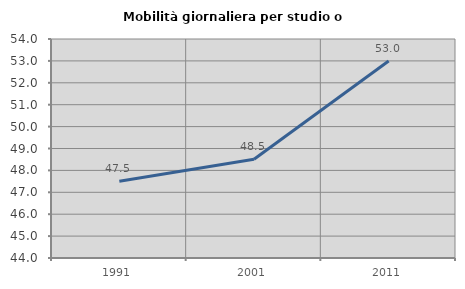
| Category | Mobilità giornaliera per studio o lavoro |
|---|---|
| 1991.0 | 47.504 |
| 2001.0 | 48.51 |
| 2011.0 | 52.991 |